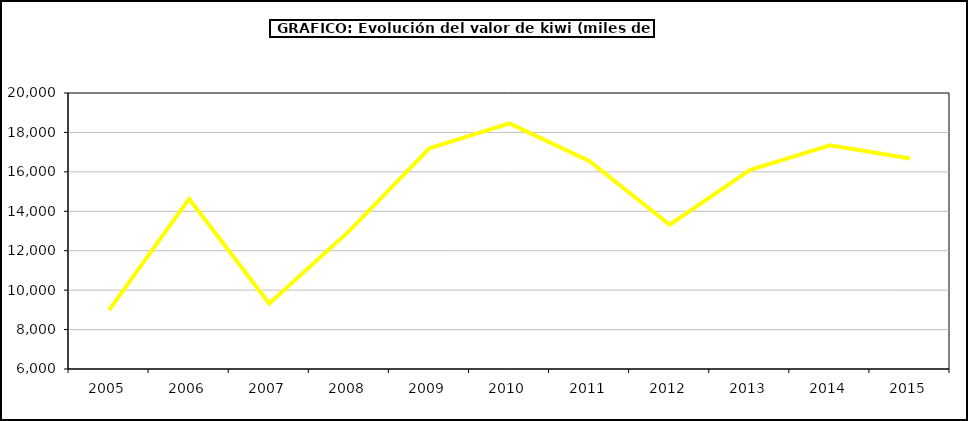
| Category | valor kiwi |
|---|---|
| 2005.0 | 8987.479 |
| 2006.0 | 14628.235 |
| 2007.0 | 9325.518 |
| 2008.0 | 13005.729 |
| 2009.0 | 17191.272 |
| 2010.0 | 18455.909 |
| 2011.0 | 16538.05 |
| 2012.0 | 13318.873 |
| 2013.0 | 16091.324 |
| 2014.0 | 17344.225 |
| 2015.0 | 16673 |